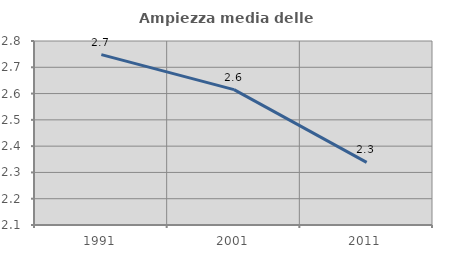
| Category | Ampiezza media delle famiglie |
|---|---|
| 1991.0 | 2.748 |
| 2001.0 | 2.615 |
| 2011.0 | 2.338 |